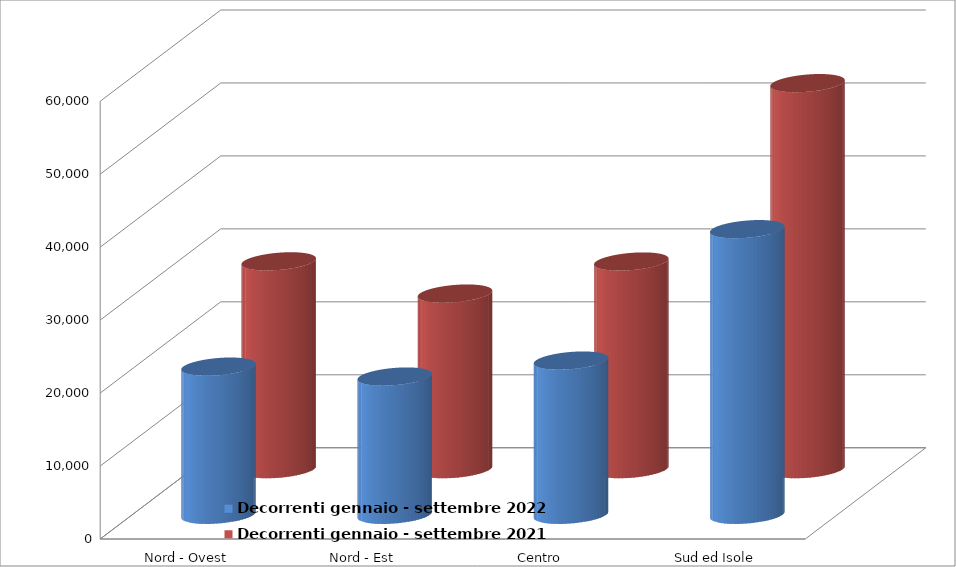
| Category | Decorrenti gennaio - settembre 2022 | Decorrenti gennaio - settembre 2021 |
|---|---|---|
| Nord - Ovest | 20313 | 28489 |
| Nord - Est | 18954 | 24073 |
| Centro | 21142 | 28466 |
| Sud ed Isole | 39153 | 52914 |